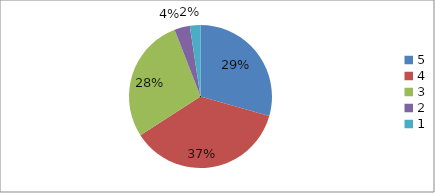
| Category | Series 0 | Series 1 |
|---|---|---|
| 5.0 | 29.4 | 29.4 |
| 4.0 | 36.5 | 36.5 |
| 3.0 | 28.2 | 28.2 |
| 2.0 | 3.5 | 3.5 |
| 1.0 | 2.4 | 2.4 |